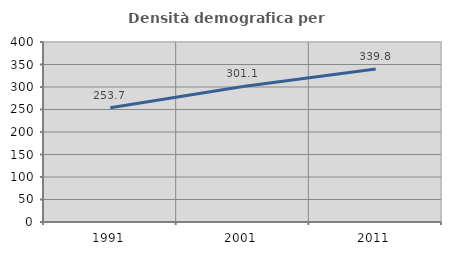
| Category | Densità demografica |
|---|---|
| 1991.0 | 253.681 |
| 2001.0 | 301.143 |
| 2011.0 | 339.826 |